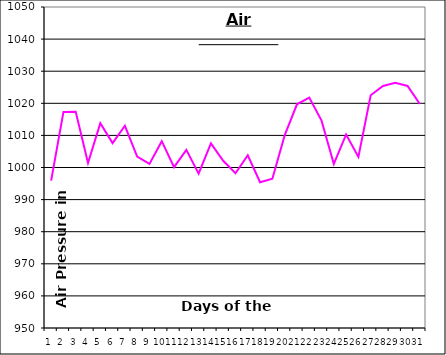
| Category | Series 0 |
|---|---|
| 0 | 995.9 |
| 1 | 1017.3 |
| 2 | 1017.4 |
| 3 | 1001.4 |
| 4 | 1013.8 |
| 5 | 1007.6 |
| 6 | 1013 |
| 7 | 1003.4 |
| 8 | 1001.1 |
| 9 | 1008.2 |
| 10 | 1000.1 |
| 11 | 1005.5 |
| 12 | 998.1 |
| 13 | 1007.5 |
| 14 | 1002.1 |
| 15 | 998.2 |
| 16 | 1003.8 |
| 17 | 995.4 |
| 18 | 996.5 |
| 19 | 1010 |
| 20 | 1019.7 |
| 21 | 1021.8 |
| 22 | 1014.6 |
| 23 | 1001.1 |
| 24 | 1010.3 |
| 25 | 1003.3 |
| 26 | 1022.5 |
| 27 | 1025.4 |
| 28 | 1026.4 |
| 29 | 1025.4 |
| 30 | 1019.8 |